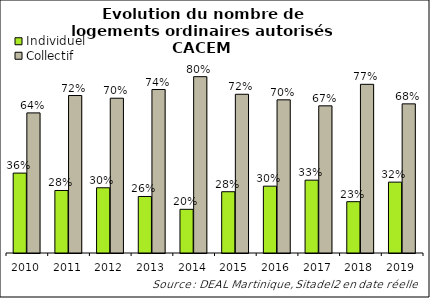
| Category | Individuel | Collectif |
|---|---|---|
| 2010.0 | 0.363 | 0.637 |
| 2011.0 | 0.284 | 0.716 |
| 2012.0 | 0.296 | 0.704 |
| 2013.0 | 0.257 | 0.743 |
| 2014.0 | 0.199 | 0.801 |
| 2015.0 | 0.279 | 0.721 |
| 2016.0 | 0.304 | 0.696 |
| 2017.0 | 0.331 | 0.669 |
| 2018.0 | 0.233 | 0.767 |
| 2019.0 | 0.322 | 0.678 |